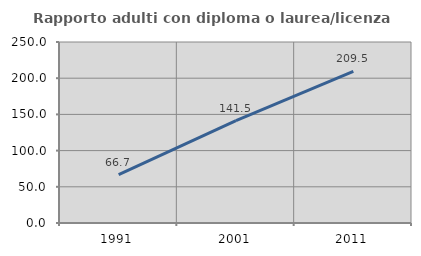
| Category | Rapporto adulti con diploma o laurea/licenza media  |
|---|---|
| 1991.0 | 66.667 |
| 2001.0 | 141.53 |
| 2011.0 | 209.497 |